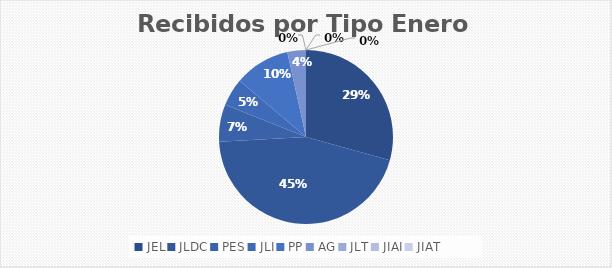
| Category | Series 0 |
|---|---|
| JEL | 17 |
| JLDC | 26 |
| PES | 4 |
| JLI | 3 |
| PP | 6 |
| AG | 2 |
| JLT | 0 |
| JIAI | 0 |
| JIAT | 0 |